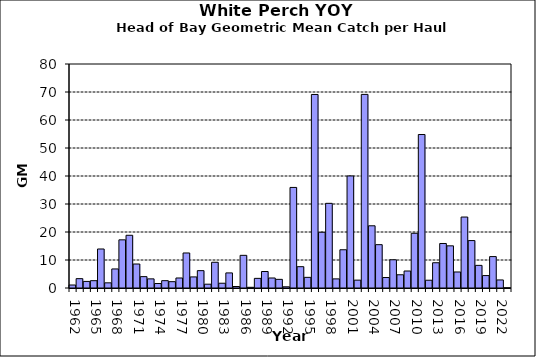
| Category | Series 0 |
|---|---|
| 1962.0 | 1.068 |
| 1963.0 | 3.339 |
| 1964.0 | 2.353 |
| 1965.0 | 2.617 |
| 1966.0 | 13.93 |
| 1967.0 | 1.845 |
| 1968.0 | 6.808 |
| 1969.0 | 17.204 |
| 1970.0 | 18.832 |
| 1971.0 | 8.567 |
| 1972.0 | 4.061 |
| 1973.0 | 3.262 |
| 1974.0 | 1.601 |
| 1975.0 | 2.621 |
| 1976.0 | 2.259 |
| 1977.0 | 3.576 |
| 1978.0 | 12.508 |
| 1979.0 | 3.957 |
| 1980.0 | 6.195 |
| 1981.0 | 1.36 |
| 1982.0 | 9.189 |
| 1983.0 | 1.704 |
| 1984.0 | 5.39 |
| 1985.0 | 0.532 |
| 1986.0 | 11.664 |
| 1987.0 | 0.247 |
| 1988.0 | 3.442 |
| 1989.0 | 5.888 |
| 1990.0 | 3.574 |
| 1991.0 | 3.088 |
| 1992.0 | 0.425 |
| 1993.0 | 35.917 |
| 1994.0 | 7.615 |
| 1995.0 | 3.805 |
| 1996.0 | 69.116 |
| 1997.0 | 19.914 |
| 1998.0 | 30.237 |
| 1999.0 | 3.257 |
| 2000.0 | 13.658 |
| 2001.0 | 40.018 |
| 2002.0 | 2.807 |
| 2003.0 | 69.143 |
| 2004.0 | 22.22 |
| 2005.0 | 15.478 |
| 2006.0 | 3.741 |
| 2007.0 | 10.082 |
| 2008.0 | 4.724 |
| 2009.0 | 6.07 |
| 2010.0 | 19.545 |
| 2011.0 | 54.813 |
| 2012.0 | 2.774 |
| 2013.0 | 9.021 |
| 2014.0 | 15.896 |
| 2015.0 | 15.058 |
| 2016.0 | 5.722 |
| 2017.0 | 25.345 |
| 2018.0 | 16.937 |
| 2019.0 | 8.085 |
| 2020.0 | 4.44 |
| 2021.0 | 11.22 |
| 2022.0 | 2.874 |
| 2023.0 | 0.044 |